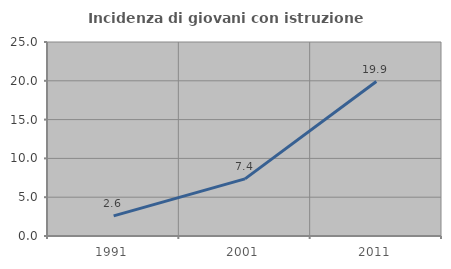
| Category | Incidenza di giovani con istruzione universitaria |
|---|---|
| 1991.0 | 2.594 |
| 2001.0 | 7.366 |
| 2011.0 | 19.907 |